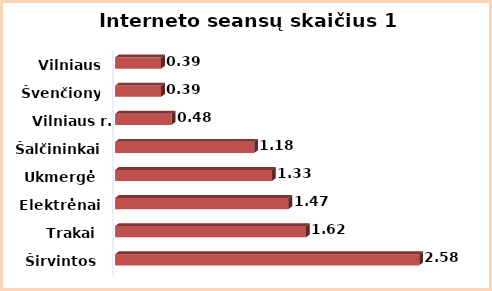
| Category | Series 0 |
|---|---|
| Širvintos | 2.58 |
| Trakai | 1.62 |
| Elektrėnai | 1.47 |
| Ukmergė | 1.33 |
| Šalčininkai | 1.18 |
| Vilniaus r. | 0.48 |
| Švenčionys | 0.39 |
| Vilniaus m. | 0.39 |